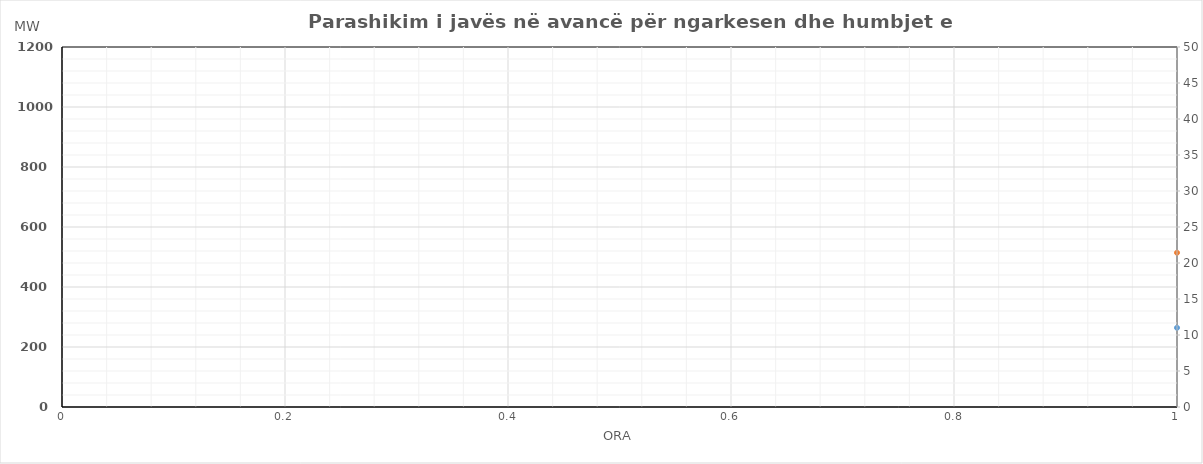
| Category | Ngarkesa (MWh) |
|---|---|
| 0 | 514.177 |
| 1 | 470.287 |
| 2 | 451.317 |
| 3 | 448.277 |
| 4 | 455.463 |
| 5 | 492.682 |
| 6 | 579.399 |
| 7 | 697.503 |
| 8 | 799.513 |
| 9 | 854.028 |
| 10 | 873.921 |
| 11 | 891.442 |
| 12 | 904.925 |
| 13 | 914.734 |
| 14 | 899.716 |
| 15 | 900.373 |
| 16 | 953.642 |
| 17 | 981.259 |
| 18 | 958.973 |
| 19 | 927.74 |
| 20 | 876.36 |
| 21 | 794.059 |
| 22 | 692.543 |
| 23 | 586.456 |
| 24 | 523.079 |
| 25 | 478.649 |
| 26 | 462.485 |
| 27 | 457.159 |
| 28 | 464.225 |
| 29 | 512.624 |
| 30 | 625.597 |
| 31 | 770.793 |
| 32 | 843.021 |
| 33 | 871.064 |
| 34 | 856.901 |
| 35 | 861.49 |
| 36 | 868.048 |
| 37 | 888.733 |
| 38 | 894.37 |
| 39 | 897.949 |
| 40 | 952.214 |
| 41 | 985.395 |
| 42 | 957.888 |
| 43 | 924.723 |
| 44 | 871.523 |
| 45 | 793.53 |
| 46 | 689.041 |
| 47 | 594.588 |
| 48 | 537.809 |
| 49 | 495.455 |
| 50 | 478.465 |
| 51 | 473.662 |
| 52 | 478.85 |
| 53 | 533.884 |
| 54 | 653.162 |
| 55 | 804.181 |
| 56 | 870.679 |
| 57 | 893.159 |
| 58 | 874.295 |
| 59 | 868.234 |
| 60 | 872.638 |
| 61 | 887.921 |
| 62 | 893.043 |
| 63 | 897.886 |
| 64 | 957.931 |
| 65 | 1023.719 |
| 66 | 1006.175 |
| 67 | 974.214 |
| 68 | 920.502 |
| 69 | 833.764 |
| 70 | 713.068 |
| 71 | 603.067 |
| 72 | 537.653 |
| 73 | 498.091 |
| 74 | 482.711 |
| 75 | 477.318 |
| 76 | 485.763 |
| 77 | 546.828 |
| 78 | 682.015 |
| 79 | 847.328 |
| 80 | 899.641 |
| 81 | 907.315 |
| 82 | 870.423 |
| 83 | 858.514 |
| 84 | 855.755 |
| 85 | 874.387 |
| 86 | 894.229 |
| 87 | 899.824 |
| 88 | 961.805 |
| 89 | 1027.02 |
| 90 | 1003.759 |
| 91 | 969.209 |
| 92 | 916.315 |
| 93 | 832.373 |
| 94 | 711.61 |
| 95 | 611.2 |
| 96 | 526.877 |
| 97 | 495.949 |
| 98 | 475.941 |
| 99 | 469.937 |
| 100 | 485.98 |
| 101 | 540.732 |
| 102 | 680.475 |
| 103 | 839.425 |
| 104 | 898.726 |
| 105 | 895.359 |
| 106 | 864.67 |
| 107 | 840.767 |
| 108 | 836.789 |
| 109 | 846.231 |
| 110 | 874.145 |
| 111 | 883.097 |
| 112 | 942.642 |
| 113 | 1025.317 |
| 114 | 1013.944 |
| 115 | 989.072 |
| 116 | 940.91 |
| 117 | 851.673 |
| 118 | 726.437 |
| 119 | 614.825 |
| 120 | 512.043 |
| 121 | 479.654 |
| 122 | 460.851 |
| 123 | 456.828 |
| 124 | 467.497 |
| 125 | 507.495 |
| 126 | 613.354 |
| 127 | 740.259 |
| 128 | 829.599 |
| 129 | 873.88 |
| 130 | 886.996 |
| 131 | 896.174 |
| 132 | 900.875 |
| 133 | 901.135 |
| 134 | 903.315 |
| 135 | 908.133 |
| 136 | 968.754 |
| 137 | 1026.283 |
| 138 | 1008.873 |
| 139 | 979.266 |
| 140 | 929.465 |
| 141 | 838.561 |
| 142 | 723.288 |
| 143 | 612.062 |
| 144 | 536.909 |
| 145 | 492.708 |
| 146 | 475.275 |
| 147 | 471.122 |
| 148 | 476.302 |
| 149 | 529.658 |
| 150 | 625.141 |
| 151 | 768.474 |
| 152 | 863.049 |
| 153 | 903.891 |
| 154 | 908.595 |
| 155 | 901.935 |
| 156 | 913.938 |
| 157 | 921.24 |
| 158 | 902.746 |
| 159 | 900.468 |
| 160 | 964.409 |
| 161 | 1026.341 |
| 162 | 1008.906 |
| 163 | 974.686 |
| 164 | 918.936 |
| 165 | 829.524 |
| 166 | 714.766 |
| 167 | 597.425 |